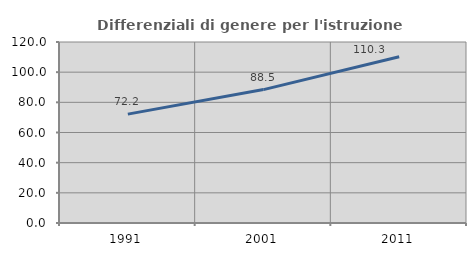
| Category | Differenziali di genere per l'istruzione superiore |
|---|---|
| 1991.0 | 72.172 |
| 2001.0 | 88.453 |
| 2011.0 | 110.252 |